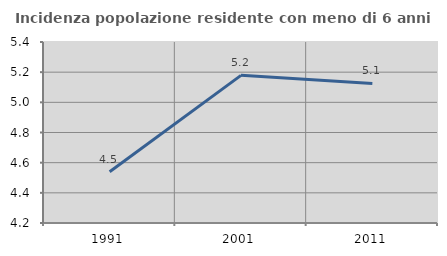
| Category | Incidenza popolazione residente con meno di 6 anni |
|---|---|
| 1991.0 | 4.539 |
| 2001.0 | 5.179 |
| 2011.0 | 5.125 |